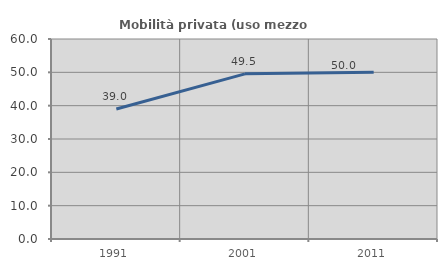
| Category | Mobilità privata (uso mezzo privato) |
|---|---|
| 1991.0 | 38.983 |
| 2001.0 | 49.55 |
| 2011.0 | 50 |